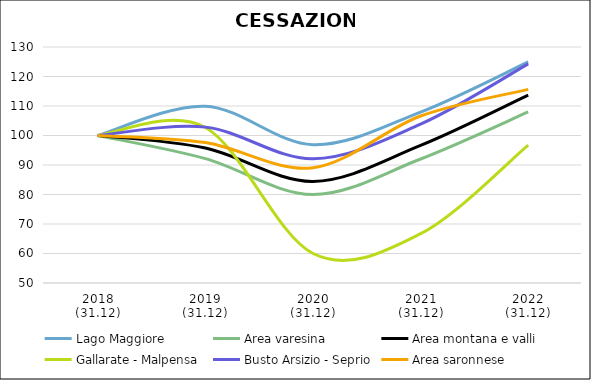
| Category | Lago Maggiore | Area varesina | Area montana e valli | Gallarate - Malpensa | Busto Arsizio - Seprio | Area saronnese |
|---|---|---|---|---|---|---|
| 2018
(31.12) | 100 | 100 | 100 | 100 | 100 | 100 |
| 2019
(31.12) | 109.914 | 92.177 | 95.75 | 102.724 | 102.84 | 97.612 |
| 2020
(31.12) | 96.873 | 79.994 | 84.439 | 60.001 | 92.099 | 89.068 |
| 2021
(31.12) | 107.94 | 92.038 | 96.627 | 66.707 | 103.845 | 106.599 |
| 2022
(31.12) | 124.928 | 107.967 | 113.672 | 96.757 | 124.263 | 115.635 |